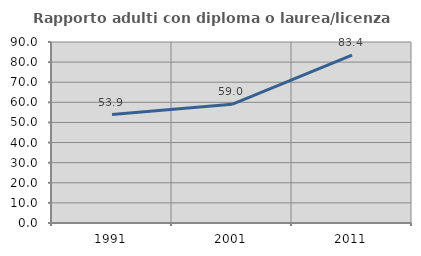
| Category | Rapporto adulti con diploma o laurea/licenza media  |
|---|---|
| 1991.0 | 53.913 |
| 2001.0 | 58.989 |
| 2011.0 | 83.42 |